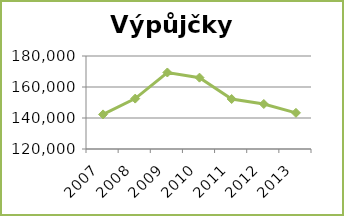
| Category | Výpůjčky celkem |
|---|---|
| 2007.0 | 142319 |
| 2008.0 | 152520 |
| 2009.0 | 169358 |
| 2010.0 | 166029 |
| 2011.0 | 152251 |
| 2012.0 | 149034 |
| 2013.0 | 143333 |